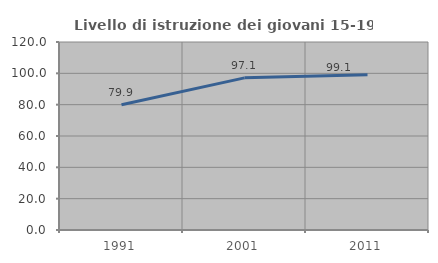
| Category | Livello di istruzione dei giovani 15-19 anni |
|---|---|
| 1991.0 | 79.899 |
| 2001.0 | 97.122 |
| 2011.0 | 99.065 |